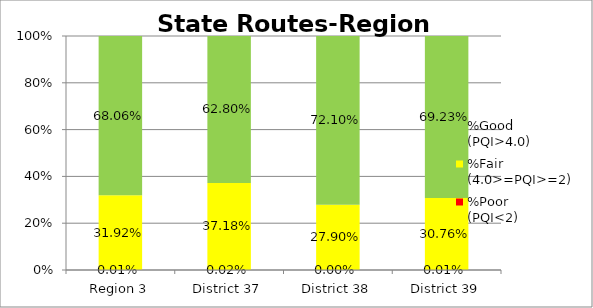
| Category | %Poor
(PQI<2) | %Fair
(4.0>=PQI>=2) | %Good
(PQI>4.0) |
|---|---|---|---|
| Region 3 | 0 | 0.319 | 0.681 |
| District 37 | 0 | 0.372 | 0.628 |
| District 38 | 0 | 0.279 | 0.721 |
| District 39 | 0 | 0.308 | 0.692 |